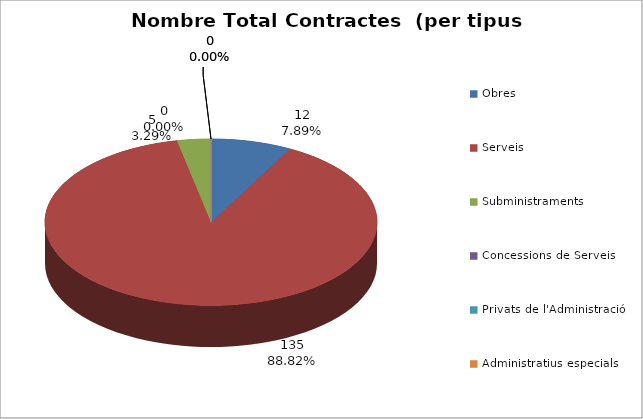
| Category | Nombre Total Contractes |
|---|---|
| Obres | 12 |
| Serveis | 135 |
| Subministraments | 5 |
| Concessions de Serveis | 0 |
| Privats de l'Administració | 0 |
| Administratius especials | 0 |